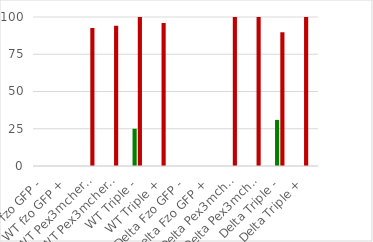
| Category | GFP | RFP | BFP |
|---|---|---|---|
| WT fzo GFP - | 0 | 0 | 0 |
| WT fzo GFP + | 0 | 0 | 0 |
| WT Pex3mcherry - | 0 | 92.632 | 0 |
| WT Pex3mcherry + | 0 | 94.118 | 0 |
| WT Triple - | 25 | 100 | 0 |
| WT Triple + | 0 | 96.04 | 0 |
| Delta Fzo GFP - | 0 | 0 | 0 |
| Delta Fzo GFP + | 0 | 0 | 0 |
| Delta Pex3mcherry - | 0 | 100 | 0 |
| Delta Pex3mcherry + | 0 | 100 | 0 |
| Delta Triple - | 30.952 | 89.72 | 0 |
| Delta Triple + | 0 | 100 | 0 |